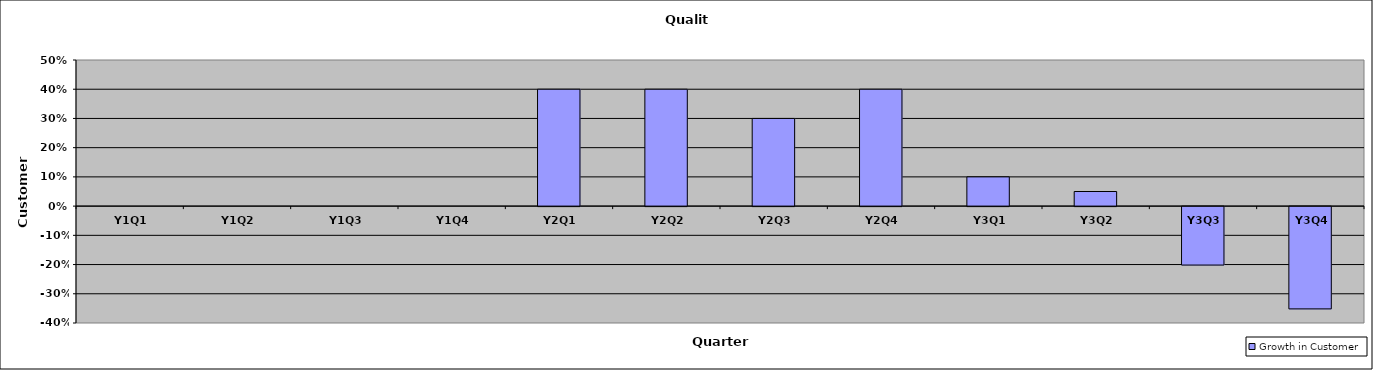
| Category | Growth in Customer |
|---|---|
| Y1Q1 | 0 |
| Y1Q2 | 0 |
| Y1Q3 | 0 |
| Y1Q4 | 0 |
| Y2Q1 | 0.4 |
| Y2Q2 | 0.4 |
| Y2Q3 | 0.3 |
| Y2Q4 | 0.4 |
| Y3Q1 | 0.1 |
| Y3Q2 | 0.05 |
| Y3Q3 | -0.2 |
| Y3Q4 | -0.35 |